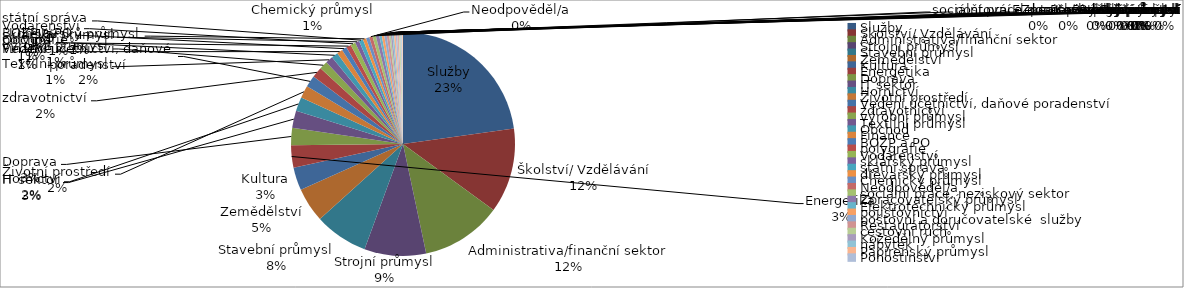
| Category | Series 0 |
|---|---|
| Služby | 192 |
| Školství/ Vzdělávání | 103 |
| Administrativa/finanční sektor | 98 |
| Strojní průmysl | 75 |
| Stavební průmysl | 65 |
| Zemědělství | 42 |
| Kultura | 28 |
| Energetika | 27 |
| Doprava | 21 |
| IT sektor | 21 |
| Hornictví | 17 |
| Životní prostředí | 15 |
| Vedení účetnictví, daňové poradenství | 14 |
| zdravotnictví | 13 |
| výrobní průmysl | 10 |
| Textilní průmysl | 9 |
| Obchod | 8 |
| Finance | 7 |
| BOZP a PO | 6 |
| polygrafie | 6 |
| Vodárenství | 6 |
| sklářský průmysl | 5 |
| státní správa | 5 |
| dřevařský průmysl | 4 |
| Chemický průmysl | 4 |
| Neodpověděl/a | 4 |
| sociální práce, neziskový sektor | 4 |
| Zpracovatelský průmysl | 4 |
| Elektrotechnický průmysl | 3 |
| pojišťovnictví | 3 |
| poštovní a doručovatelské  služby | 3 |
| Restaurátorství | 3 |
| cestovní ruch | 2 |
| Kožedělný průmysl | 2 |
| nábytek | 2 |
| Papírenský průmysl | 2 |
| Pohostinství | 2 |
| slévárenství | 2 |
| sport | 2 |
| Biologie vyzkum | 1 |
| skladování | 1 |
| Slévárenství | 1 |